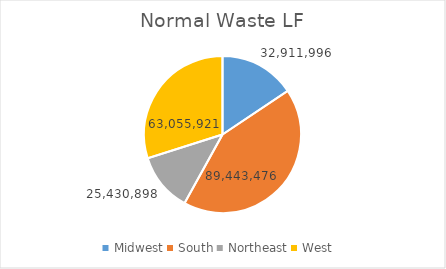
| Category | Series 0 |
|---|---|
| Midwest | 32911995.736 |
| South | 89443476.324 |
| Northeast | 25430897.709 |
| West | 63055920.672 |